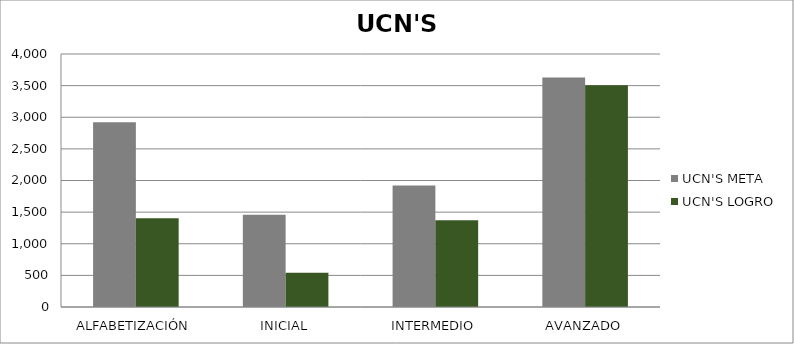
| Category | UCN'S |
|---|---|
| ALFABETIZACIÓN | 1402 |
| INICIAL | 543 |
| INTERMEDIO | 1372 |
| AVANZADO | 3506 |